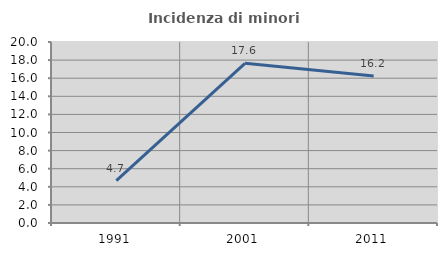
| Category | Incidenza di minori stranieri |
|---|---|
| 1991.0 | 4.688 |
| 2001.0 | 17.647 |
| 2011.0 | 16.239 |